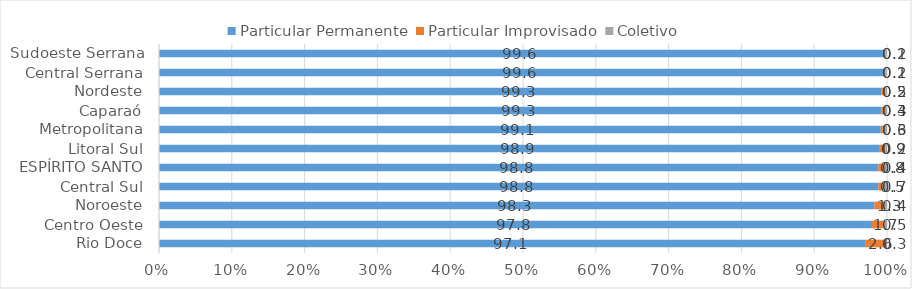
| Category | Particular Permanente | Particular Improvisado | Coletivo |
|---|---|---|---|
| Rio Doce | 97.096 | 2.645 | 0.259 |
| Centro Oeste | 97.805 | 1.708 | 0.487 |
| Noroeste | 98.285 | 1.288 | 0.427 |
| Central Sul | 98.808 | 0.527 | 0.665 |
| ESPÍRITO SANTO | 98.815 | 0.752 | 0.433 |
| Litoral Sul | 98.914 | 0.906 | 0.18 |
| Metropolitana | 99.148 | 0.292 | 0.56 |
| Caparaó | 99.254 | 0.436 | 0.31 |
| Nordeste | 99.286 | 0.471 | 0.243 |
| Central Serrana | 99.646 | 0.149 | 0.205 |
| Sudoeste Serrana | 99.647 | 0.133 | 0.22 |